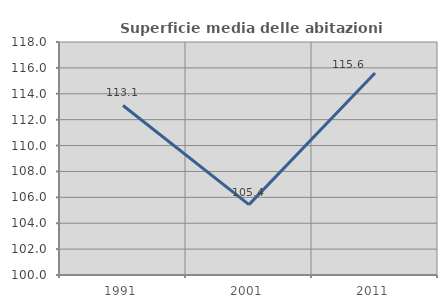
| Category | Superficie media delle abitazioni occupate |
|---|---|
| 1991.0 | 113.098 |
| 2001.0 | 105.434 |
| 2011.0 | 115.607 |